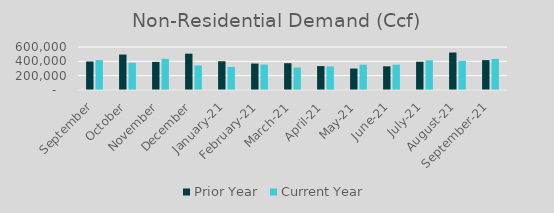
| Category | Prior Year | Current Year |
|---|---|---|
| September | 398263 | 416886.629 |
| October | 494775 | 379515 |
| November | 392357 | 434815 |
| December | 507022 | 342584.594 |
| January-21 | 400923.849 | 322657.16 |
| February-21 | 369131.684 | 354041 |
| March-21 | 374117 | 313343 |
| April-21 | 333800.488 | 329084.722 |
| May-21 | 299245.56 | 353085 |
| June-21 | 330441.187 | 353141.442 |
| July-21 | 394304.316 | 414577.112 |
| August-21 | 522963.473 | 407774.995 |
| September-21 | 416886.629 | 434192.442 |